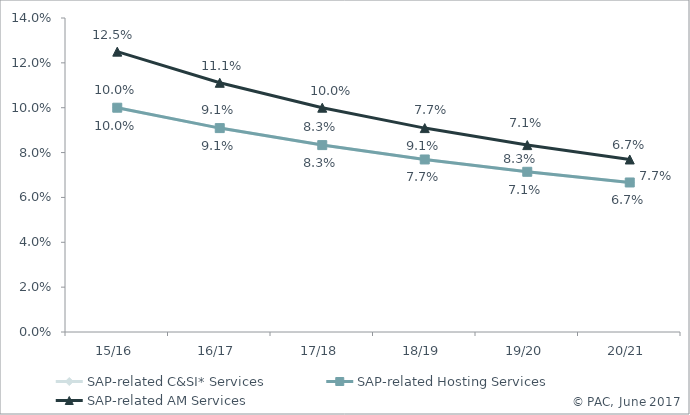
| Category | SAP-related C&SI* Services | SAP-related Hosting Services | SAP-related AM Services |
|---|---|---|---|
| 15/16 | 0.1 | 0.1 | 0.125 |
| 16/17 | 0.091 | 0.091 | 0.111 |
| 17/18 | 0.083 | 0.083 | 0.1 |
| 18/19 | 0.077 | 0.077 | 0.091 |
| 19/20 | 0.071 | 0.071 | 0.083 |
| 20/21 | 0.067 | 0.067 | 0.077 |